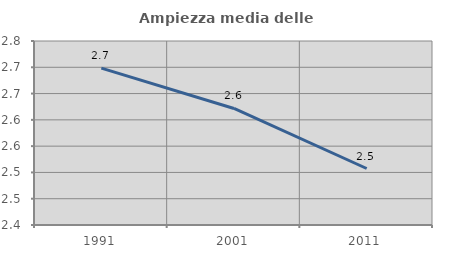
| Category | Ampiezza media delle famiglie |
|---|---|
| 1991.0 | 2.698 |
| 2001.0 | 2.622 |
| 2011.0 | 2.507 |